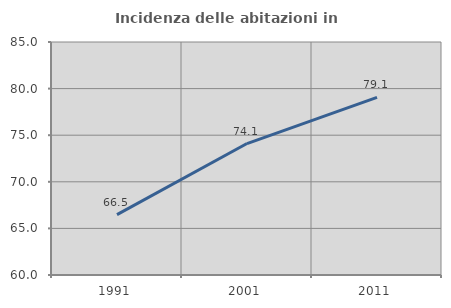
| Category | Incidenza delle abitazioni in proprietà  |
|---|---|
| 1991.0 | 66.477 |
| 2001.0 | 74.105 |
| 2011.0 | 79.065 |